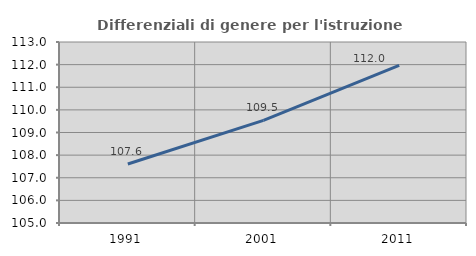
| Category | Differenziali di genere per l'istruzione superiore |
|---|---|
| 1991.0 | 107.61 |
| 2001.0 | 109.535 |
| 2011.0 | 111.965 |